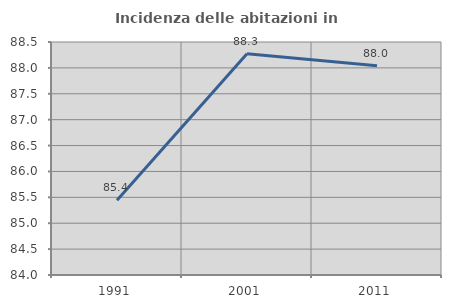
| Category | Incidenza delle abitazioni in proprietà  |
|---|---|
| 1991.0 | 85.444 |
| 2001.0 | 88.273 |
| 2011.0 | 88.042 |